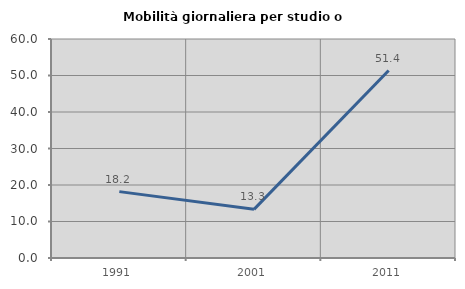
| Category | Mobilità giornaliera per studio o lavoro |
|---|---|
| 1991.0 | 18.182 |
| 2001.0 | 13.333 |
| 2011.0 | 51.351 |